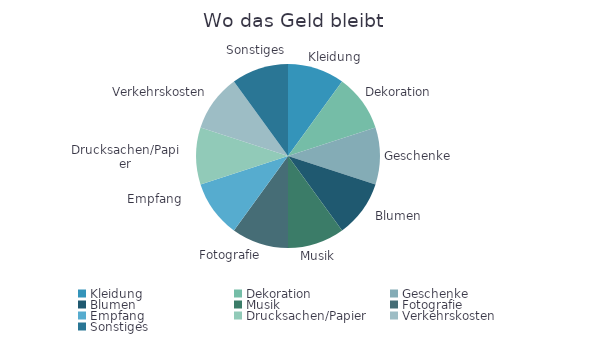
| Category | Betrag |
|---|---|
| Kleidung | 1 |
| Dekoration | 1 |
| Geschenke | 1 |
| Blumen | 1 |
| Musik | 1 |
| Fotografie | 1 |
| Empfang | 1 |
| Drucksachen/Papier | 1 |
| Verkehrskosten | 1 |
| Sonstiges | 1 |